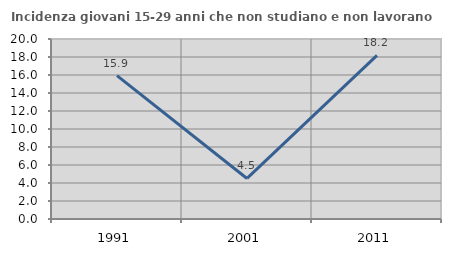
| Category | Incidenza giovani 15-29 anni che non studiano e non lavorano  |
|---|---|
| 1991.0 | 15.933 |
| 2001.0 | 4.505 |
| 2011.0 | 18.182 |